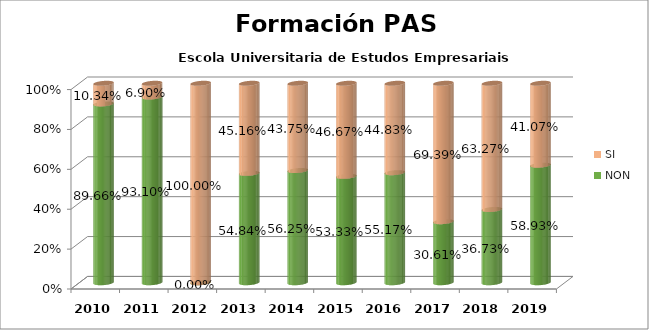
| Category | NON | SI |
|---|---|---|
| 2010.0 | 0.897 | 0.103 |
| 2011.0 | 0.931 | 0.069 |
| 2012.0 | 0 | 1 |
| 2013.0 | 0.548 | 0.452 |
| 2014.0 | 0.562 | 0.438 |
| 2015.0 | 0.533 | 0.467 |
| 2016.0 | 0.552 | 0.448 |
| 2017.0 | 0.306 | 0.694 |
| 2018.0 | 0.367 | 0.633 |
| 2019.0 | 0.589 | 0.411 |